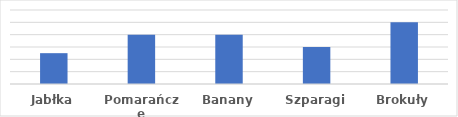
| Category | Kwota |
|---|---|
| Jabłka | 500 |
| Pomarańcze | 800 |
| Banany | 800 |
| Szparagi | 600 |
| Brokuły | 1000 |